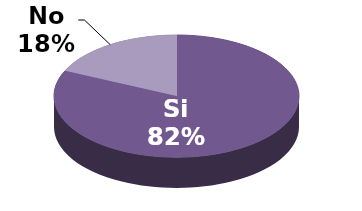
| Category | Series 1 |
|---|---|
| Si | 9 |
| No | 2 |